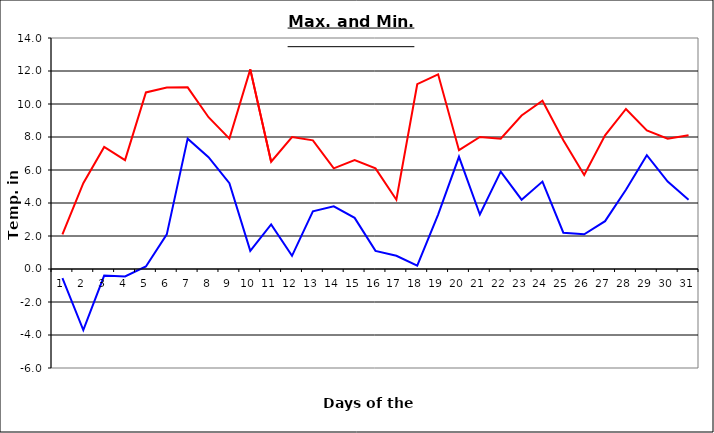
| Category | Series 0 | Series 1 |
|---|---|---|
| 0 | 2.1 | -0.56 |
| 1 | 5.2 | -3.7 |
| 2 | 7.4 | -0.4 |
| 3 | 6.6 | -0.45 |
| 4 | 10.7 | 0.15 |
| 5 | 11 | 2.1 |
| 6 | 11.01 | 7.9 |
| 7 | 9.2 | 6.78 |
| 8 | 7.9 | 5.2 |
| 9 | 12.1 | 1.1 |
| 10 | 6.5 | 2.7 |
| 11 | 8 | 0.8 |
| 12 | 7.8 | 3.5 |
| 13 | 6.1 | 3.8 |
| 14 | 6.6 | 3.1 |
| 15 | 6.1 | 1.1 |
| 16 | 4.2 | 0.8 |
| 17 | 11.2 | 0.2 |
| 18 | 11.8 | 3.3 |
| 19 | 7.2 | 6.8 |
| 20 | 8 | 3.3 |
| 21 | 7.9 | 5.9 |
| 22 | 9.3 | 4.2 |
| 23 | 10.2 | 5.3 |
| 24 | 7.8 | 2.2 |
| 25 | 5.7 | 2.1 |
| 26 | 8.1 | 2.9 |
| 27 | 9.7 | 4.8 |
| 28 | 8.4 | 6.9 |
| 29 | 7.9 | 5.3 |
| 30 | 8.1 | 4.2 |